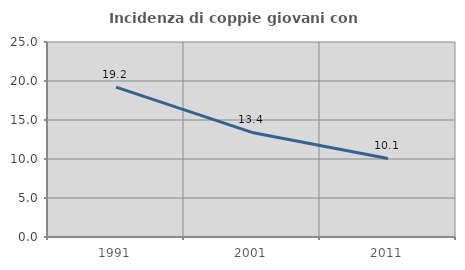
| Category | Incidenza di coppie giovani con figli |
|---|---|
| 1991.0 | 19.224 |
| 2001.0 | 13.406 |
| 2011.0 | 10.073 |